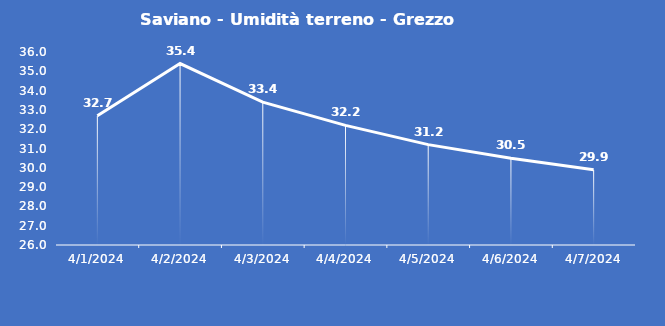
| Category | Saviano - Umidità terreno - Grezzo (%VWC) |
|---|---|
| 4/1/24 | 32.7 |
| 4/2/24 | 35.4 |
| 4/3/24 | 33.4 |
| 4/4/24 | 32.2 |
| 4/5/24 | 31.2 |
| 4/6/24 | 30.5 |
| 4/7/24 | 29.9 |